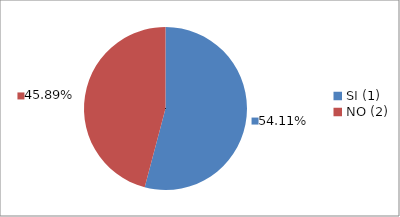
| Category | Series 0 |
|---|---|
| SI (1) | 0.541 |
| NO (2) | 0.459 |